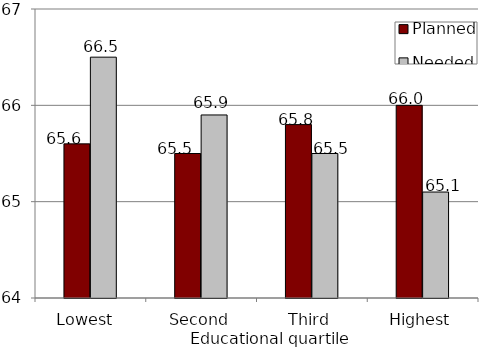
| Category | Planned | Needed |
|---|---|---|
| Lowest  | 65.6 | 66.5 |
| Second | 65.5 | 65.9 |
| Third | 65.8 | 65.5 |
| Highest | 66 | 65.1 |